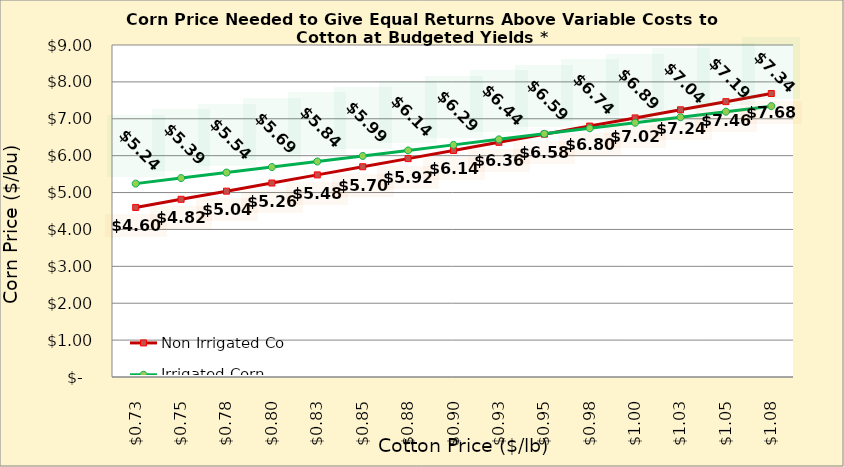
| Category | Non Irrigated Corn | Irrigated Corn |
|---|---|---|
| 0.7249999999999999 | 4.597 | 5.242 |
| 0.7499999999999999 | 4.817 | 5.392 |
| 0.7749999999999999 | 5.038 | 5.542 |
| 0.7999999999999999 | 5.258 | 5.692 |
| 0.825 | 5.479 | 5.842 |
| 0.85 | 5.7 | 5.992 |
| 0.875 | 5.92 | 6.142 |
| 0.9 | 6.141 | 6.292 |
| 0.925 | 6.361 | 6.442 |
| 0.9500000000000001 | 6.582 | 6.592 |
| 0.9750000000000001 | 6.803 | 6.742 |
| 1.0 | 7.023 | 6.892 |
| 1.025 | 7.244 | 7.042 |
| 1.0499999999999998 | 7.464 | 7.192 |
| 1.0749999999999997 | 7.685 | 7.342 |